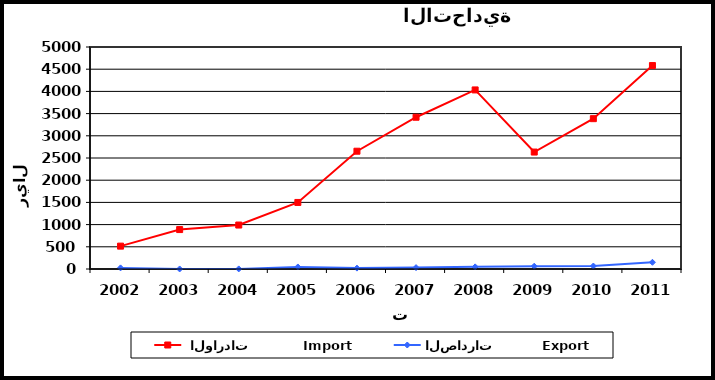
| Category |  الواردات           Import | الصادرات          Export |
|---|---|---|
| 2002.0 | 515 | 25 |
| 2003.0 | 888 | 1 |
| 2004.0 | 990 | 2 |
| 2005.0 | 1499 | 46 |
| 2006.0 | 2653 | 20 |
| 2007.0 | 3418 | 31 |
| 2008.0 | 4033 | 48 |
| 2009.0 | 2634 | 63 |
| 2010.0 | 3386 | 67 |
| 2011.0 | 4582 | 151 |